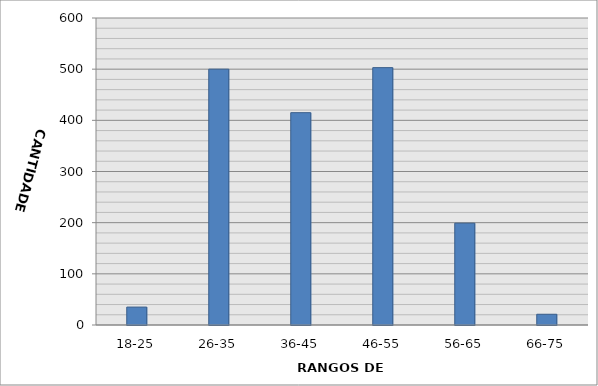
| Category | Series 0 |
|---|---|
| 18-25 | 35 |
| 26-35 | 500 |
| 36-45 | 415 |
| 46-55 | 503 |
| 56-65 | 199 |
| 66-75 | 21 |